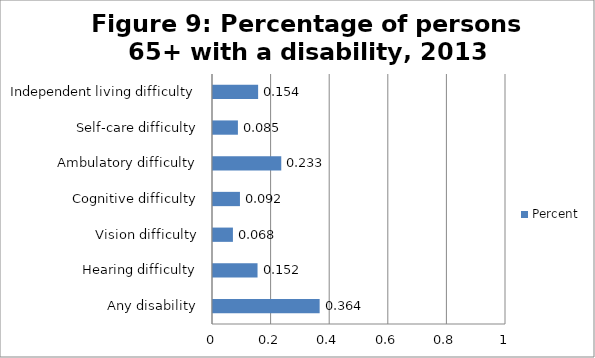
| Category | Percent |
|---|---|
| Any disability | 0.364 |
| Hearing difficulty | 0.152 |
| Vision difficulty | 0.068 |
| Cognitive difficulty | 0.092 |
| Ambulatory difficulty | 0.233 |
| Self-care difficulty | 0.085 |
| Independent living difficulty | 0.154 |